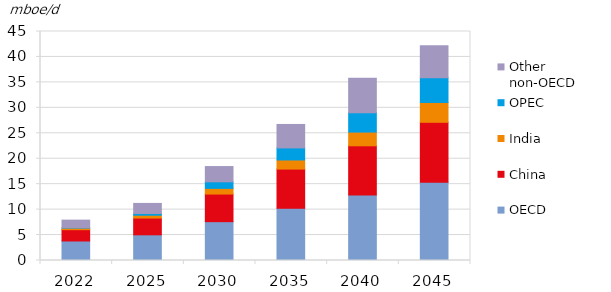
| Category | OECD | China | India | OPEC | Other non-OECD |
|---|---|---|---|---|---|
| 2022.0 | 3.833 | 2.224 | 0.32 | 0.055 | 1.499 |
| 2025.0 | 5.047 | 3.295 | 0.553 | 0.346 | 1.976 |
| 2030.0 | 7.631 | 5.428 | 1.112 | 1.286 | 3.003 |
| 2035.0 | 10.278 | 7.684 | 1.791 | 2.37 | 4.611 |
| 2040.0 | 12.873 | 9.668 | 2.693 | 3.816 | 6.755 |
| 2045.0 | 15.397 | 11.762 | 3.896 | 4.871 | 6.271 |